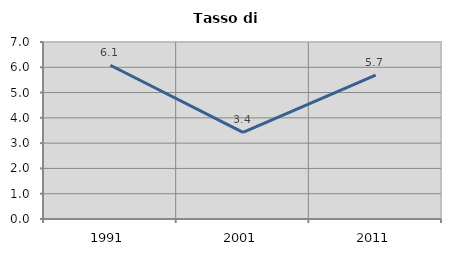
| Category | Tasso di disoccupazione   |
|---|---|
| 1991.0 | 6.08 |
| 2001.0 | 3.428 |
| 2011.0 | 5.689 |